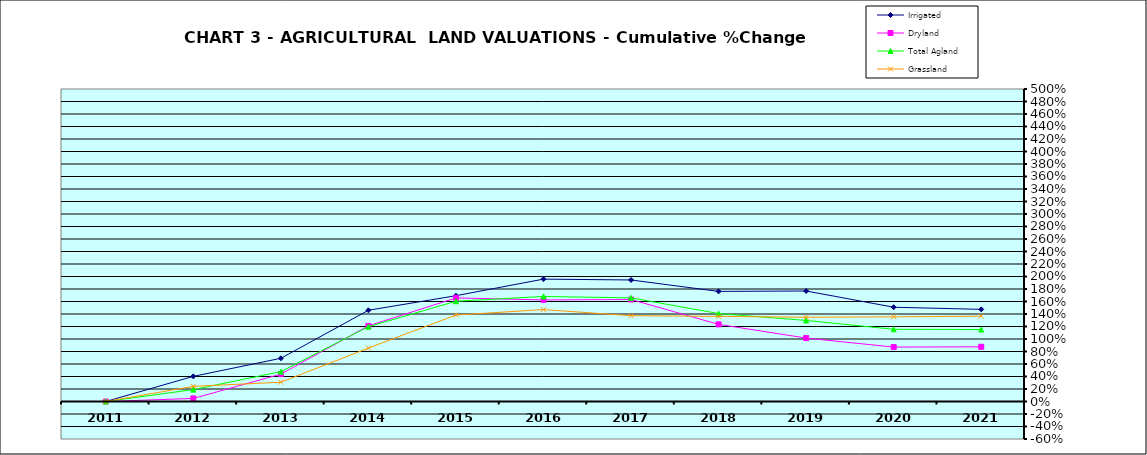
| Category | Irrigated | Dryland | Total Agland | Grassland |
|---|---|---|---|---|
| 2011.0 | 0 | 0 | 0 | 0 |
| 2012.0 | 0.402 | 0.049 | 0.19 | 0.242 |
| 2013.0 | 0.691 | 0.439 | 0.478 | 0.308 |
| 2014.0 | 1.46 | 1.21 | 1.197 | 0.855 |
| 2015.0 | 1.693 | 1.657 | 1.604 | 1.384 |
| 2016.0 | 1.958 | 1.625 | 1.681 | 1.471 |
| 2017.0 | 1.944 | 1.632 | 1.658 | 1.373 |
| 2018.0 | 1.762 | 1.234 | 1.407 | 1.362 |
| 2019.0 | 1.768 | 1.015 | 1.297 | 1.348 |
| 2020.0 | 1.508 | 0.871 | 1.156 | 1.354 |
| 2021.0 | 1.474 | 0.875 | 1.151 | 1.366 |